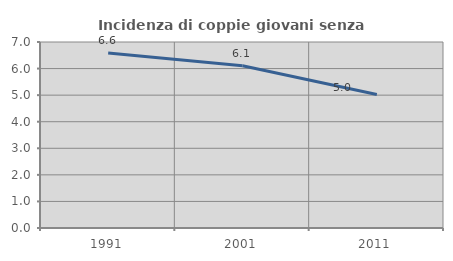
| Category | Incidenza di coppie giovani senza figli |
|---|---|
| 1991.0 | 6.584 |
| 2001.0 | 6.109 |
| 2011.0 | 5.023 |